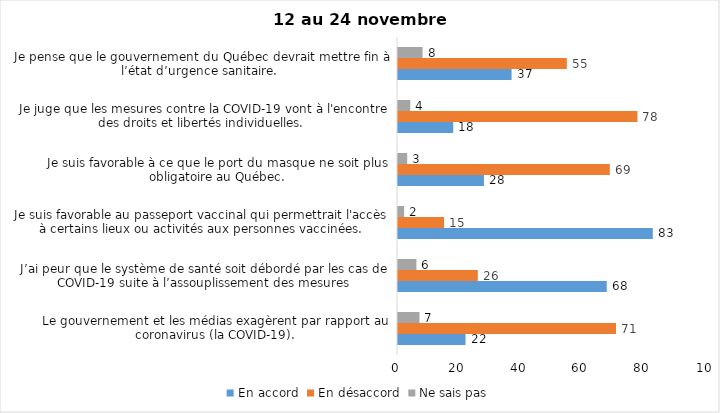
| Category | En accord | En désaccord | Ne sais pas |
|---|---|---|---|
| Le gouvernement et les médias exagèrent par rapport au coronavirus (la COVID-19). | 22 | 71 | 7 |
| J’ai peur que le système de santé soit débordé par les cas de COVID-19 suite à l’assouplissement des mesures | 68 | 26 | 6 |
| Je suis favorable au passeport vaccinal qui permettrait l'accès à certains lieux ou activités aux personnes vaccinées. | 83 | 15 | 2 |
| Je suis favorable à ce que le port du masque ne soit plus obligatoire au Québec. | 28 | 69 | 3 |
| Je juge que les mesures contre la COVID-19 vont à l'encontre des droits et libertés individuelles.  | 18 | 78 | 4 |
| Je pense que le gouvernement du Québec devrait mettre fin à l’état d’urgence sanitaire.  | 37 | 55 | 8 |